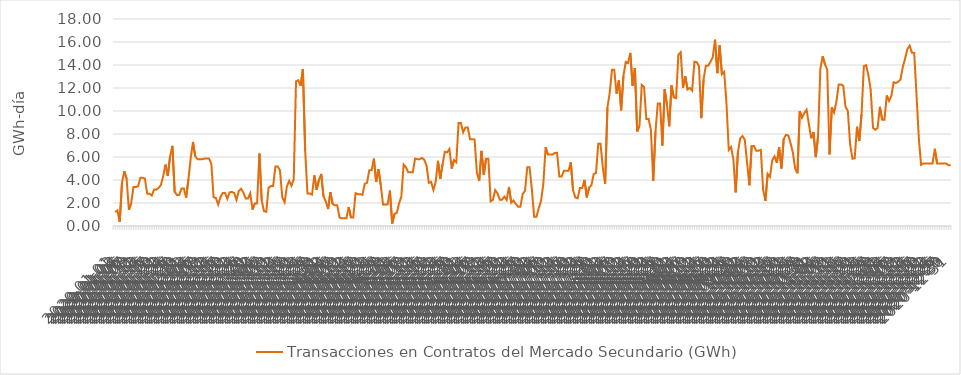
| Category | Transacciones en Contratos del Mercado Secundario (GWh) |
|---|---|
| 2020-01-01 | 1.205 |
| 2020-01-02 | 1.355 |
| 2020-01-03 | 0.35 |
| 2020-01-04 | 3.787 |
| 2020-01-05 | 4.761 |
| 2020-01-06 | 4.131 |
| 2020-01-07 | 1.416 |
| 2020-01-08 | 1.991 |
| 2020-01-09 | 3.395 |
| 2020-01-10 | 3.395 |
| 2020-01-11 | 3.455 |
| 2020-01-12 | 4.186 |
| 2020-01-13 | 4.186 |
| 2020-01-14 | 4.126 |
| 2020-01-15 | 2.812 |
| 2020-01-16 | 2.813 |
| 2020-01-17 | 2.647 |
| 2020-01-18 | 3.165 |
| 2020-01-19 | 3.162 |
| 2020-01-20 | 3.313 |
| 2020-01-21 | 3.575 |
| 2020-01-22 | 4.348 |
| 2020-01-23 | 5.348 |
| 2020-01-24 | 4.348 |
| 2020-01-25 | 6.069 |
| 2020-01-26 | 6.967 |
| 2020-01-27 | 2.966 |
| 2020-01-28 | 2.701 |
| 2020-01-29 | 2.701 |
| 2020-01-30 | 3.266 |
| 2020-01-31 | 3.266 |
| 2020-02-01 | 2.472 |
| 2020-02-02 | 4.046 |
| 2020-02-03 | 5.892 |
| 2020-02-04 | 7.31 |
| 2020-02-05 | 6.045 |
| 2020-02-06 | 5.809 |
| 2020-02-07 | 5.809 |
| 2020-02-08 | 5.809 |
| 2020-02-09 | 5.859 |
| 2020-02-10 | 5.859 |
| 2020-02-11 | 5.859 |
| 2020-02-12 | 5.42 |
| 2020-02-13 | 2.506 |
| 2020-02-14 | 2.431 |
| 2020-02-15 | 1.868 |
| 2020-02-16 | 2.502 |
| 2020-02-17 | 2.876 |
| 2020-02-18 | 2.876 |
| 2020-02-19 | 2.371 |
| 2020-02-20 | 2.931 |
| 2020-02-21 | 2.957 |
| 2020-02-22 | 2.879 |
| 2020-02-23 | 2.272 |
| 2020-02-24 | 3.039 |
| 2020-02-25 | 3.246 |
| 2020-02-26 | 2.916 |
| 2020-02-27 | 2.386 |
| 2020-02-28 | 2.386 |
| 2020-02-29 | 2.842 |
| 2020-03-01 | 1.433 |
| 2020-03-02 | 1.966 |
| 2020-03-03 | 1.966 |
| 2020-03-04 | 6.307 |
| 2020-03-05 | 2.23 |
| 2020-03-06 | 1.3 |
| 2020-03-07 | 1.236 |
| 2020-03-08 | 3.318 |
| 2020-03-09 | 3.482 |
| 2020-03-10 | 3.482 |
| 2020-03-11 | 5.182 |
| 2020-03-12 | 5.182 |
| 2020-03-13 | 4.832 |
| 2020-03-14 | 2.486 |
| 2020-03-15 | 2.069 |
| 2020-03-16 | 3.432 |
| 2020-03-17 | 3.929 |
| 2020-03-18 | 3.5 |
| 2020-03-19 | 4.064 |
| 2020-03-20 | 12.574 |
| 2020-03-21 | 12.68 |
| 2020-03-22 | 12.172 |
| 2020-03-23 | 13.657 |
| 2020-03-24 | 6.532 |
| 2020-03-25 | 2.824 |
| 2020-03-26 | 2.824 |
| 2020-03-27 | 2.736 |
| 2020-03-28 | 4.409 |
| 2020-03-29 | 3.143 |
| 2020-03-30 | 4.002 |
| 2020-03-31 | 4.529 |
| 2020-04-01 | 2.564 |
| 2020-04-02 | 2.136 |
| 2020-04-03 | 1.471 |
| 2020-04-04 | 2.937 |
| 2020-04-05 | 1.906 |
| 2020-04-06 | 1.804 |
| 2020-04-07 | 1.804 |
| 2020-04-08 | 0.74 |
| 2020-04-09 | 0.67 |
| 2020-04-10 | 0.67 |
| 2020-04-11 | 0.67 |
| 2020-04-12 | 1.645 |
| 2020-04-13 | 0.74 |
| 2020-04-14 | 0.74 |
| 2020-04-15 | 2.851 |
| 2020-04-16 | 2.771 |
| 2020-04-17 | 2.771 |
| 2020-04-18 | 2.701 |
| 2020-04-19 | 3.657 |
| 2020-04-20 | 3.755 |
| 2020-04-21 | 4.839 |
| 2020-04-22 | 4.839 |
| 2020-04-23 | 5.859 |
| 2020-04-24 | 3.824 |
| 2020-04-25 | 4.934 |
| 2020-04-26 | 3.576 |
| 2020-04-27 | 1.861 |
| 2020-04-28 | 1.861 |
| 2020-04-29 | 1.861 |
| 2020-04-30 | 3.081 |
| 2020-05-01 | 0.215 |
| 2020-05-02 | 1.055 |
| 2020-05-03 | 1.145 |
| 2020-05-04 | 1.955 |
| 2020-05-05 | 2.56 |
| 2020-05-06 | 5.342 |
| 2020-05-07 | 5.112 |
| 2020-05-08 | 4.673 |
| 2020-05-09 | 4.673 |
| 2020-05-10 | 4.673 |
| 2020-05-11 | 5.863 |
| 2020-05-12 | 5.813 |
| 2020-05-13 | 5.813 |
| 2020-05-14 | 5.924 |
| 2020-05-15 | 5.763 |
| 2020-05-16 | 5.253 |
| 2020-05-17 | 3.752 |
| 2020-05-18 | 3.84 |
| 2020-05-19 | 3.132 |
| 2020-05-20 | 3.827 |
| 2020-05-21 | 5.668 |
| 2020-05-22 | 4.107 |
| 2020-05-23 | 5.38 |
| 2020-05-24 | 6.456 |
| 2020-05-25 | 6.4 |
| 2020-05-26 | 6.697 |
| 2020-05-27 | 4.993 |
| 2020-05-28 | 5.738 |
| 2020-05-29 | 5.541 |
| 2020-05-30 | 8.963 |
| 2020-05-31 | 8.963 |
| 2020-06-01 | 8.149 |
| 2020-06-02 | 8.574 |
| 2020-06-03 | 8.574 |
| 2020-06-04 | 7.554 |
| 2020-06-05 | 7.554 |
| 2020-06-06 | 7.518 |
| 2020-06-07 | 4.619 |
| 2020-06-08 | 3.91 |
| 2020-06-09 | 6.527 |
| 2020-06-10 | 4.436 |
| 2020-06-11 | 5.856 |
| 2020-06-12 | 5.855 |
| 2020-06-13 | 2.139 |
| 2020-06-14 | 2.272 |
| 2020-06-15 | 3.119 |
| 2020-06-16 | 2.841 |
| 2020-06-17 | 2.287 |
| 2020-06-18 | 2.287 |
| 2020-06-19 | 2.558 |
| 2020-06-20 | 2.266 |
| 2020-06-21 | 3.395 |
| 2020-06-22 | 2.017 |
| 2020-06-23 | 2.209 |
| 2020-06-24 | 1.914 |
| 2020-06-25 | 1.684 |
| 2020-06-26 | 1.684 |
| 2020-06-27 | 2.783 |
| 2020-06-28 | 3.053 |
| 2020-06-29 | 5.113 |
| 2020-06-30 | 5.117 |
| 2020-07-01 | 3.194 |
| 2020-07-02 | 0.799 |
| 2020-07-03 | 0.799 |
| 2020-07-04 | 1.533 |
| 2020-07-05 | 2.182 |
| 2020-07-06 | 3.629 |
| 2020-07-07 | 6.848 |
| 2020-07-08 | 6.207 |
| 2020-07-09 | 6.207 |
| 2020-07-10 | 6.207 |
| 2020-07-11 | 6.35 |
| 2020-07-12 | 6.364 |
| 2020-07-13 | 4.303 |
| 2020-07-14 | 4.303 |
| 2020-07-15 | 4.798 |
| 2020-07-16 | 4.798 |
| 2020-07-17 | 4.798 |
| 2020-07-18 | 5.539 |
| 2020-07-19 | 3.098 |
| 2020-07-20 | 2.486 |
| 2020-07-21 | 2.408 |
| 2020-07-22 | 3.308 |
| 2020-07-23 | 3.308 |
| 2020-07-24 | 4.003 |
| 2020-07-25 | 2.486 |
| 2020-07-26 | 3.348 |
| 2020-07-27 | 3.53 |
| 2020-07-28 | 4.508 |
| 2020-07-29 | 4.604 |
| 2020-07-30 | 7.143 |
| 2020-07-31 | 7.143 |
| 2020-08-01 | 5.053 |
| 2020-08-02 | 3.667 |
| 2020-08-03 | 10.291 |
| 2020-08-04 | 11.584 |
| 2020-08-05 | 13.583 |
| 2020-08-06 | 13.583 |
| 2020-08-07 | 11.516 |
| 2020-08-08 | 12.648 |
| 2020-08-09 | 10.057 |
| 2020-08-10 | 13.056 |
| 2020-08-11 | 14.263 |
| 2020-08-12 | 14.178 |
| 2020-08-13 | 15.055 |
| 2020-08-14 | 12.195 |
| 2020-08-15 | 13.739 |
| 2020-08-16 | 8.219 |
| 2020-08-17 | 8.711 |
| 2020-08-18 | 12.261 |
| 2020-08-19 | 12.084 |
| 2020-08-20 | 9.302 |
| 2020-08-21 | 9.302 |
| 2020-08-22 | 8.362 |
| 2020-08-23 | 3.921 |
| 2020-08-24 | 8.22 |
| 2020-08-25 | 10.646 |
| 2020-08-26 | 10.646 |
| 2020-08-27 | 6.986 |
| 2020-08-28 | 11.896 |
| 2020-08-29 | 10.564 |
| 2020-08-30 | 8.674 |
| 2020-08-31 | 12.218 |
| 2020-09-01 | 11.178 |
| 2020-09-02 | 11.117 |
| 2020-09-03 | 14.89 |
| 2020-09-04 | 15.107 |
| 2020-09-05 | 12.021 |
| 2020-09-06 | 13.025 |
| 2020-09-07 | 11.873 |
| 2020-09-08 | 12.013 |
| 2020-09-09 | 11.77 |
| 2020-09-10 | 14.288 |
| 2020-09-11 | 14.246 |
| 2020-09-12 | 13.903 |
| 2020-09-13 | 9.378 |
| 2020-09-14 | 12.746 |
| 2020-09-15 | 13.94 |
| 2020-09-16 | 13.94 |
| 2020-09-17 | 14.283 |
| 2020-09-18 | 14.653 |
| 2020-09-19 | 16.198 |
| 2020-09-20 | 13.291 |
| 2020-09-21 | 15.713 |
| 2020-09-22 | 13.201 |
| 2020-09-23 | 13.411 |
| 2020-09-24 | 10.664 |
| 2020-09-25 | 6.606 |
| 2020-09-26 | 6.875 |
| 2020-09-27 | 5.837 |
| 2020-09-28 | 2.925 |
| 2020-09-29 | 6.436 |
| 2020-09-30 | 7.62 |
| 2020-10-01 | 7.828 |
| 2020-10-02 | 7.507 |
| 2020-10-03 | 5.484 |
| 2020-10-04 | 3.544 |
| 2020-10-05 | 6.961 |
| 2020-10-06 | 6.949 |
| 2020-10-07 | 6.55 |
| 2020-10-08 | 6.546 |
| 2020-10-09 | 6.615 |
| 2020-10-10 | 3.178 |
| 2020-10-11 | 2.19 |
| 2020-10-12 | 4.532 |
| 2020-10-13 | 4.274 |
| 2020-10-14 | 5.727 |
| 2020-10-15 | 6.056 |
| 2020-10-16 | 5.484 |
| 2020-10-17 | 6.85 |
| 2020-10-18 | 5.004 |
| 2020-10-19 | 7.573 |
| 2020-10-20 | 7.926 |
| 2020-10-21 | 7.879 |
| 2020-10-22 | 7.192 |
| 2020-10-23 | 6.381 |
| 2020-10-24 | 4.991 |
| 2020-10-25 | 4.588 |
| 2020-10-26 | 9.99 |
| 2020-10-27 | 9.412 |
| 2020-10-28 | 9.817 |
| 2020-10-29 | 10.109 |
| 2020-10-30 | 8.853 |
| 2020-10-31 | 7.624 |
| 2020-11-01 | 8.164 |
| 2020-11-02 | 5.99 |
| 2020-11-03 | 7.791 |
| 2020-11-04 | 13.657 |
| 2020-11-05 | 14.76 |
| 2020-11-06 | 14.076 |
| 2020-11-07 | 13.59 |
| 2020-11-08 | 6.224 |
| 2020-11-09 | 10.308 |
| 2020-11-10 | 9.873 |
| 2020-11-11 | 10.795 |
| 2020-11-12 | 12.295 |
| 2020-11-13 | 12.305 |
| 2020-11-14 | 12.192 |
| 2020-11-15 | 10.354 |
| 2020-11-16 | 10.014 |
| 2020-11-17 | 7.111 |
| 2020-11-18 | 5.846 |
| 2020-11-19 | 5.894 |
| 2020-11-20 | 8.629 |
| 2020-11-21 | 7.387 |
| 2020-11-22 | 9.732 |
| 2020-11-23 | 13.902 |
| 2020-11-24 | 13.976 |
| 2020-11-25 | 13.086 |
| 2020-11-26 | 11.805 |
| 2020-11-27 | 8.532 |
| 2020-11-28 | 8.372 |
| 2020-11-29 | 8.519 |
| 2020-11-30 | 10.362 |
| 2020-12-01 | 9.245 |
| 2020-12-02 | 9.245 |
| 2020-12-03 | 11.348 |
| 2020-12-04 | 10.872 |
| 2020-12-05 | 11.289 |
| 2020-12-06 | 12.499 |
| 2020-12-07 | 12.433 |
| 2020-12-08 | 12.539 |
| 2020-12-09 | 12.748 |
| 2020-12-10 | 13.816 |
| 2020-12-11 | 14.543 |
| 2020-12-12 | 15.375 |
| 2020-12-13 | 15.685 |
| 2020-12-14 | 15.07 |
| 2020-12-15 | 15.044 |
| 2020-12-16 | 11.402 |
| 2020-12-17 | 7.657 |
| 2020-12-18 | 5.315 |
| 2020-12-19 | 5.435 |
| 2020-12-20 | 5.435 |
| 2020-12-21 | 5.435 |
| 2020-12-22 | 5.435 |
| 2020-12-23 | 5.435 |
| 2020-12-24 | 6.716 |
| 2020-12-25 | 5.435 |
| 2020-12-26 | 5.435 |
| 2020-12-27 | 5.435 |
| 2020-12-28 | 5.435 |
| 2020-12-29 | 5.435 |
| 2020-12-30 | 5.272 |
| 2020-12-31 | 5.272 |